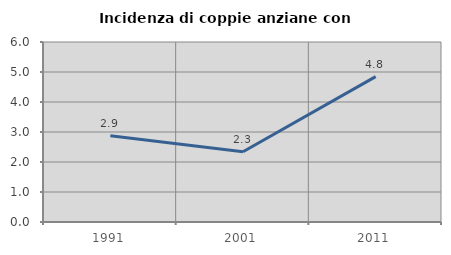
| Category | Incidenza di coppie anziane con figli |
|---|---|
| 1991.0 | 2.878 |
| 2001.0 | 2.34 |
| 2011.0 | 4.845 |